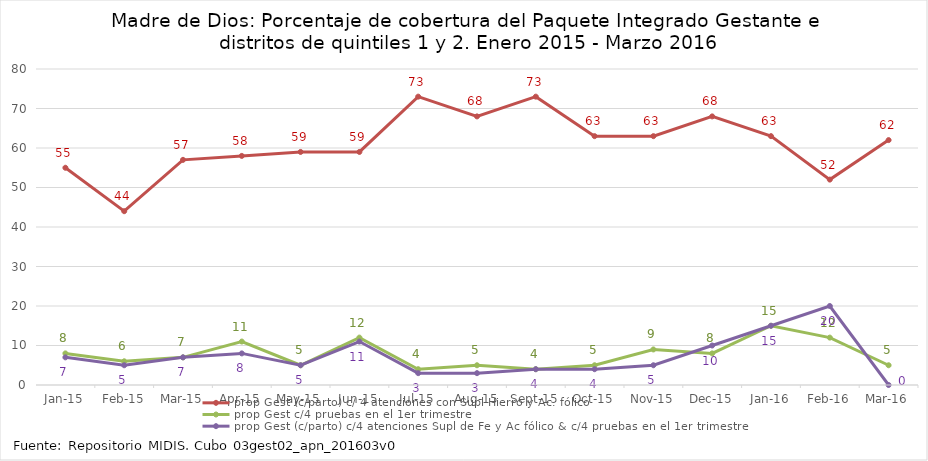
| Category | prop Gest (c/parto) c/ 4 atenciones con Supl Hierro y Ac. fólico | prop Gest c/4 pruebas en el 1er trimestre | prop Gest (c/parto) c/4 atenciones Supl de Fe y Ac fólico & c/4 pruebas en el 1er trimestre |
|---|---|---|---|
| 2015-01-01 | 55 | 8 | 7 |
| 2015-02-01 | 44 | 6 | 5 |
| 2015-03-01 | 57 | 7 | 7 |
| 2015-04-01 | 58 | 11 | 8 |
| 2015-05-01 | 59 | 5 | 5 |
| 2015-06-01 | 59 | 12 | 11 |
| 2015-07-01 | 73 | 4 | 3 |
| 2015-08-01 | 68 | 5 | 3 |
| 2015-09-01 | 73 | 4 | 4 |
| 2015-10-01 | 63 | 5 | 4 |
| 2015-11-01 | 63 | 9 | 5 |
| 2015-12-01 | 68 | 8 | 10 |
| 2016-01-01 | 63 | 15 | 15 |
| 2016-02-01 | 52 | 12 | 20 |
| 2016-03-01 | 62 | 5 | 0 |